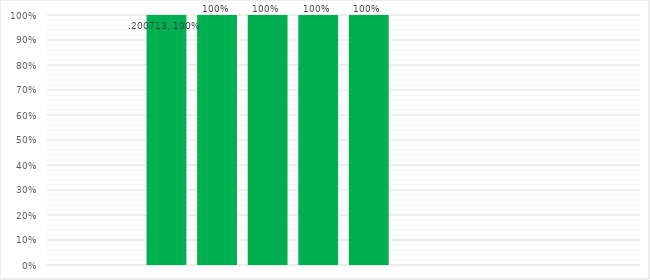
| Category | .200713 | .200715 | .200716 | .200714 | .200738 | .200739 | .200740 | .200744 |
|---|---|---|---|---|---|---|---|---|
| 0 | 1 | 1 | 1 | 1 | 1 | 0 | 0 | 0 |